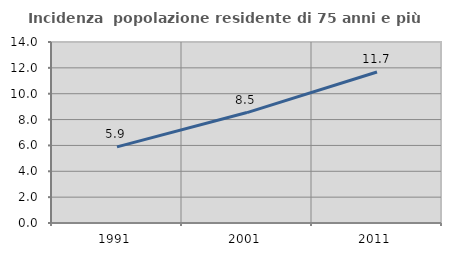
| Category | Incidenza  popolazione residente di 75 anni e più |
|---|---|
| 1991.0 | 5.884 |
| 2001.0 | 8.541 |
| 2011.0 | 11.679 |